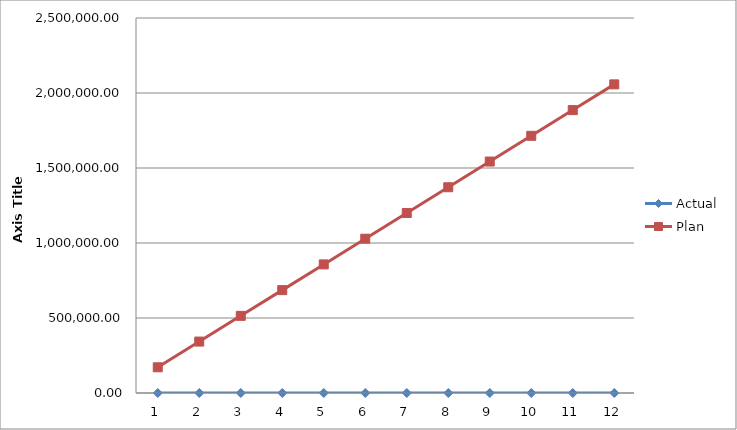
| Category | Actual | Plan |
|---|---|---|
| 0 | 0 | 171454.667 |
| 1 | 0 | 342909.333 |
| 2 | 0 | 514364 |
| 3 | 0 | 685818.667 |
| 4 | 0 | 857273.333 |
| 5 | 0 | 1028728 |
| 6 | 0 | 1200182.667 |
| 7 | 0 | 1371637.333 |
| 8 | 0 | 1543092 |
| 9 | 0 | 1714546.667 |
| 10 | 0 | 1886001.333 |
| 11 | 0 | 2057456 |